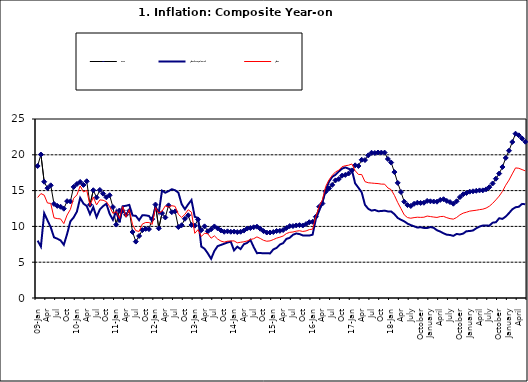
| Category | Food | All Items less Farm Produce | All Items |
|---|---|---|---|
| 09-Jan | 18.436 | 8.013 | 14.034 |
| Feb | 20.041 | 7.178 | 14.584 |
| Mar | 16.233 | 11.842 | 14.366 |
| Apr | 15.342 | 10.85 | 13.268 |
| May | 15.74 | 9.88 | 13.212 |
| June | 13.138 | 8.472 | 11.194 |
| Jul | 12.867 | 8.285 | 11.09 |
| Aug | 12.746 | 8.044 | 11.046 |
| Sep | 12.472 | 7.431 | 10.39 |
| Oct | 13.524 | 8.933 | 11.588 |
| Nov | 13.482 | 10.702 | 12.368 |
| Dec | 15.518 | 11.249 | 13.93 |
| 10-Jan | 15.918 | 12.063 | 14.398 |
| Feb | 16.208 | 13.978 | 15.649 |
| Mar | 15.79 | 13.184 | 14.812 |
| Apr | 16.306 | 12.844 | 15.044 |
| May | 13.023 | 11.711 | 12.915 |
| Jun | 15.053 | 12.686 | 14.099 |
| Jul | 14.043 | 11.287 | 13.002 |
| Aug | 15.09 | 12.366 | 13.702 |
| Sep | 14.57 | 12.83 | 13.65 |
| Oct | 14.065 | 13.168 | 13.45 |
| Nov | 14.351 | 11.746 | 12.766 |
| Dec | 12.701 | 10.917 | 11.815 |
| 11-Jan | 10.255 | 12.118 | 12.08 |
| Feb | 12.221 | 10.569 | 11.1 |
| Mar | 12.169 | 12.815 | 12.779 |
| Apr | 11.629 | 12.882 | 11.291 |
| May | 12.179 | 13.006 | 12.352 |
| Jun | 9.22 | 11.524 | 10.23 |
| Jul | 7.877 | 11.472 | 9.397 |
| Aug | 8.665 | 10.863 | 9.301 |
| Sep | 9.479 | 11.567 | 10.339 |
| Oct | 9.656 | 11.539 | 10.544 |
| Nov | 9.623 | 11.459 | 10.54 |
| Dec | 11.02 | 10.822 | 10.283 |
| 12-Jan | 13.053 | 12.748 | 12.626 |
| 12-Feb | 9.729 | 11.901 | 11.866 |
| 12-Mar | 11.848 | 14.995 | 12.111 |
| Apr | 11.246 | 14.703 | 12.866 |
| May | 12.942 | 14.926 | 12.688 |
| Jun | 11.991 | 15.199 | 12.892 |
| Jul | 12.093 | 15.045 | 12.797 |
| Aug | 9.91 | 14.714 | 11.689 |
| Sep | 10.164 | 13.101 | 11.253 |
| Oct | 11.064 | 12.398 | 11.693 |
| Nov | 11.553 | 13.092 | 12.32 |
| Dec | 10.199 | 13.685 | 11.981 |
| 13-Jan | 10.106 | 11.342 | 9.031 |
| Feb | 10.973 | 11.184 | 9.542 |
| Mar | 9.482 | 7.179 | 8.593 |
| Apr | 10.006 | 6.874 | 9.052 |
| May | 9.321 | 6.227 | 8.964 |
| Jun | 9.606 | 5.472 | 8.353 |
| Jul | 9.994 | 6.58 | 8.682 |
| Aug | 9.723 | 7.245 | 8.231 |
| Sep | 9.437 | 7.41 | 7.952 |
| Oct | 9.249 | 7.579 | 7.807 |
| Nov | 9.313 | 7.75 | 7.931 |
| Dec | 9.253 | 7.872 | 7.957 |
| 14-Jan | 9.271 | 6.648 | 7.977 |
| Feb | 9.207 | 7.166 | 7.707 |
| Mar | 9.254 | 6.836 | 7.783 |
| Apr | 9.414 | 7.508 | 7.851 |
| May | 9.698 | 7.693 | 7.965 |
| Jun | 9.776 | 8.122 | 8.167 |
| Jul | 9.878 | 7.116 | 8.281 |
| Aug | 9.959 | 6.264 | 8.534 |
| Sep | 9.676 | 6.278 | 8.317 |
| Oct | 9.343 | 6.252 | 8.06 |
| Nov | 9.144 | 6.255 | 7.927 |
| Dec | 9.152 | 6.225 | 7.978 |
| 15-Jan | 9.215 | 6.787 | 8.157 |
| Feb | 9.359 | 6.994 | 8.359 |
| Mar | 9.376 | 7.46 | 8.494 |
| Apr | 9.49 | 7.661 | 8.655 |
| May | 9.782 | 8.253 | 9.003 |
| Jun | 10.041 | 8.403 | 9.168 |
| Jul | 10.049 | 8.83 | 9.218 |
| Aug | 10.131 | 9.01 | 9.336 |
| Sep | 10.174 | 8.928 | 9.394 |
| Oct | 10.129 | 8.742 | 9.296 |
| Nov | 10.321 | 8.732 | 9.368 |
| Dec | 10.588 | 8.727 | 9.554 |
| 16-Jan | 10.642 | 8.841 | 9.617 |
| Feb | 11.348 | 11.041 | 11.379 |
| Mar | 12.745 | 12.17 | 12.775 |
| Apr | 13.194 | 13.352 | 13.721 |
| May | 14.861 | 15.054 | 15.577 |
| Jun | 15.302 | 16.224 | 16.48 |
| Jul | 15.799 | 16.929 | 17.127 |
| Aug | 16.427 | 17.208 | 17.609 |
| Sep | 16.622 | 17.666 | 17.852 |
| Oct | 17.09 | 18.067 | 18.33 |
| Nov | 17.191 | 18.241 | 18.476 |
| Dec | 17.388 | 18.052 | 18.547 |
| 17-Jan | 17.818 | 17.867 | 18.719 |
| Feb | 18.528 | 16.011 | 17.78 |
| Mar | 18.436 | 15.404 | 17.256 |
| Apr | 19.303 | 14.75 | 17.244 |
| May | 19.266 | 13.016 | 16.251 |
| Jun | 19.915 | 12.455 | 16.098 |
| Jul | 20.284 | 12.207 | 16.053 |
| Aug | 20.251 | 12.296 | 16.012 |
| Sep | 20.321 | 12.123 | 15.979 |
| Oct | 20.306 | 12.142 | 15.905 |
| Nov | 20.308 | 12.206 | 15.901 |
| Dec | 19.415 | 12.089 | 15.372 |
| 18-Jan | 18.919 | 12.09 | 15.127 |
| Feb | 17.588 | 11.707 | 14.33 |
| Mar | 16.08 | 11.181 | 13.337 |
| Apr | 14.799 | 10.92 | 12.482 |
| May | 13.448 | 10.71 | 11.608 |
| June | 12.977 | 10.387 | 11.231 |
| July | 12.85 | 10.183 | 11.142 |
| August | 13.158 | 10.015 | 11.227 |
| September | 13.309 | 9.838 | 11.284 |
| October | 13.277 | 9.882 | 11.259 |
| November | 13.301 | 9.787 | 11.281 |
| December | 13.559 | 9.771 | 11.442 |
| January | 13.505 | 9.91 | 11.374 |
| February | 13.473 | 9.8 | 11.306 |
| March | 13.451 | 9.461 | 11.251 |
| April | 13.701 | 9.28 | 11.372 |
| May | 13.794 | 9.033 | 11.396 |
| June | 13.558 | 8.841 | 11.217 |
| July | 13.392 | 8.798 | 11.084 |
| August | 13.17 | 8.678 | 11.016 |
| September | 13.507 | 8.945 | 11.244 |
| October | 14.088 | 8.876 | 11.607 |
| November | 14.482 | 8.993 | 11.854 |
| December | 14.667 | 9.331 | 11.982 |
| January | 14.849 | 9.349 | 12.132 |
| February | 14.904 | 9.434 | 12.199 |
| March | 14.977 | 9.732 | 12.257 |
| April | 15.026 | 9.979 | 12.341 |
| May | 15.036 | 10.12 | 12.404 |
| June | 15.175 | 10.128 | 12.559 |
| July | 15.482 | 10.102 | 12.821 |
| August | 15.996 | 10.521 | 13.22 |
| September | 16.66 | 10.581 | 13.707 |
| October | 17.378 | 11.137 | 14.233 |
| November | 18.298 | 11.05 | 14.887 |
| December | 19.562 | 11.374 | 15.753 |
| January | 20.567 | 11.854 | 16.466 |
| February | 21.786 | 12.382 | 17.335 |
| March | 22.948 | 12.673 | 18.171 |
| April | 22.719 | 12.743 | 18.117 |
| May | 22.277 | 13.145 | 17.933 |
| June | 21.829 | 13.094 | 17.751 |